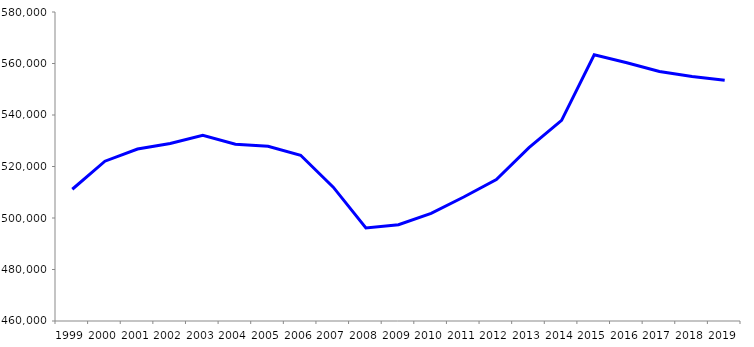
| Category | 1999 2000 2001 2002 2003 2004 2005 2006 2007 2008 2009 2010 2011 2012 2013 2014 2015 2016 2017 2018 2019 |
|---|---|
| 1999 | 511166 |
| 2000 | 522054 |
| 2001 | 526783 |
| 2002 | 528918 |
| 2003 | 532116 |
| 2004 | 528678 |
| 2005 | 527841 |
| 2006 | 524356 |
| 2007 | 511978 |
| 2008 | 496128 |
| 2009 | 497396 |
| 2010 | 501801 |
| 2011 | 508162 |
| 2012 | 514919 |
| 2013 | 527297 |
| 2014 | 537926 |
| 2015 | 563396 |
| 2016 | 560316 |
| 2017 | 556870 |
| 2018 | 554953 |
| 2019 | 553503 |